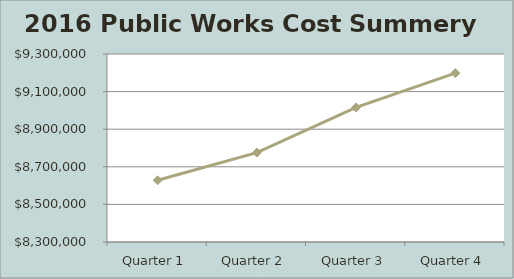
| Category | Series 0 |
|---|---|
| Quarter 1 | 8628234 |
| Quarter 2 | 8775493 |
| Quarter 3 | 9015735 |
| Quarter 4 | 9198205 |